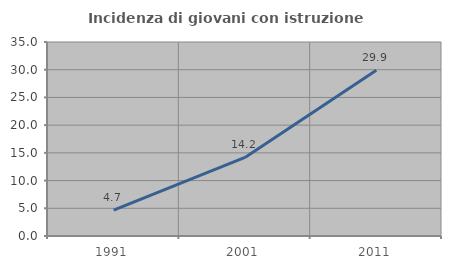
| Category | Incidenza di giovani con istruzione universitaria |
|---|---|
| 1991.0 | 4.688 |
| 2001.0 | 14.173 |
| 2011.0 | 29.921 |